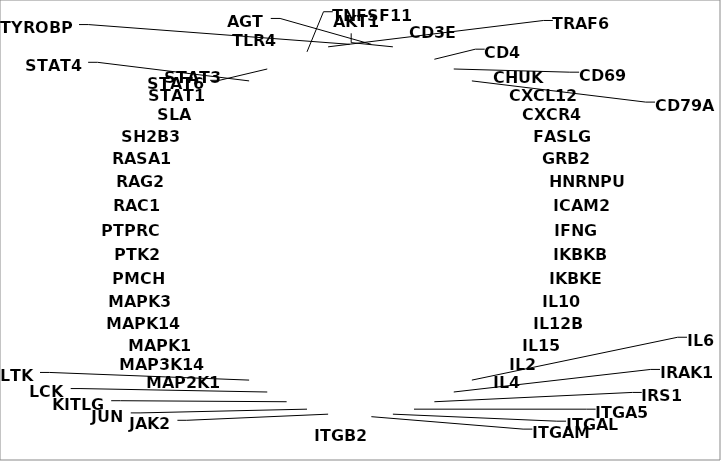
| Category | Series 0 |
|---|---|
| AGT | 1 |
| AKT1 | 1 |
| CD3E | 1 |
| CD4 | 1 |
| CD69 | 1 |
| CD79A | 1 |
| CHUK | 1 |
| CXCL12 | 1 |
| CXCR4 | 1 |
| FASLG | 1 |
| GRB2 | 1 |
| HNRNPU | 1 |
| ICAM2 | 1 |
| IFNG | 1 |
| IKBKB | 1 |
| IKBKE | 1 |
| IL10 | 1 |
| IL12B | 1 |
| IL15 | 1 |
| IL2 | 1 |
| IL4 | 1 |
| IL6 | 1 |
| IRAK1 | 1 |
| IRS1 | 1 |
| ITGA5 | 1 |
| ITGAL | 1 |
| ITGAM | 1 |
| ITGB2 | 1 |
| JAK2 | 1 |
| JUN | 1 |
| KITLG | 1 |
| LCK | 1 |
| LTK | 1 |
| MAP2K1 | 1 |
| MAP3K14 | 1 |
| MAPK1 | 1 |
| MAPK14 | 1 |
| MAPK3 | 1 |
| PMCH | 1 |
| PTK2 | 1 |
| PTPRC | 1 |
| RAC1 | 1 |
| RAG2 | 1 |
| RASA1 | 1 |
| SH2B3 | 1 |
| SLA | 1 |
| STAT1 | 1 |
| STAT3 | 1 |
| STAT4 | 1 |
| STAT6 | 1 |
| TLR4 | 1 |
| TNFSF11 | 1 |
| TRAF6 | 1 |
| TYROBP | 1 |